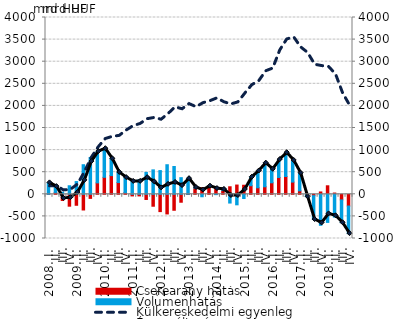
| Category | Cserearány hatás | Volumenhatás |
|---|---|---|
| 2008. I. | -1.044 | 259.64 |
|          II. | 41.359 | 132.065 |
|          III. | -139.621 | 47.132 |
|          IV. | -268.994 | 193.23 |
| 2009. I. | -248.307 | 288.029 |
|          II. | -354.843 | 669.239 |
|          III. | -92.143 | 832.273 |
|          IV. | 258.888 | 707.629 |
| 2010. I. | 384.28 | 647.365 |
|          II. | 422.697 | 381.365 |
|          III. | 265.539 | 228.685 |
|          IV. | 38.59 | 338.6 |
| 2011. I. | -36.828 | 328.117 |
|          II. | -36.355 | 329.11 |
|          III. | -116.756 | 494.304 |
|          IV. | -269.961 | 552.55 |
| 2012. I. | -391.59 | 536.595 |
|          II. | -444.132 | 669.038 |
|          III. | -361.172 | 629.417 |
|          IV. | -179.441 | 376.274 |
| 2013. I. | -4.515 | 358.186 |
|          II. | 139.151 | 14.248 |
|          III. | 149.526 | -55.397 |
|          IV. | 173.27 | 10.534 |
| 2014. I. | 137.22 | -7.699 |
|          II. | 88.476 | 22.431 |
|          III. | 170.33 | -198.095 |
|          IV. | 209.329 | -237.909 |
| 2015. I. | 204.963 | -95.757 |
|          II. | 194.115 | 193.073 |
|          III. | 147.463 | 380.049 |
|          IV. | 169.977 | 535.273 |
| 2016. I. | 260.311 | 305.439 |
|          II. | 380.884 | 404.034 |
|          III. | 402.048 | 538.793 |
|          IV. | 276.22 | 489.407 |
| 2017. I. | 78.341 | 399.031 |
|          II. | -3.749 | -52.319 |
|          III. | -31.372 | -540.022 |
|          IV. | 52.727 | -701.552 |
| 2018. I. | 192.605 | -635.947 |
|          II. | 28.428 | -515.011 |
|          III. | -126.93 | -517.036 |
|          IV. | -265.58 | -624.541 |